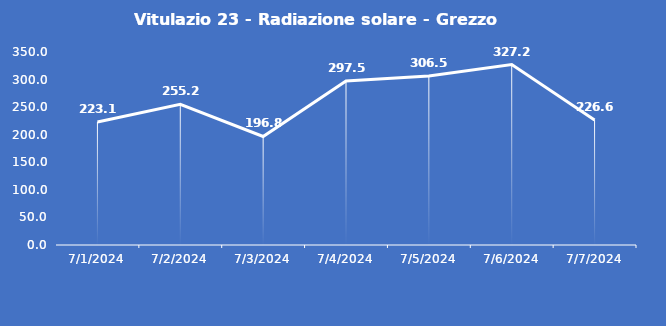
| Category | Vitulazio 23 - Radiazione solare - Grezzo (W/m2) |
|---|---|
| 7/1/24 | 223.1 |
| 7/2/24 | 255.2 |
| 7/3/24 | 196.8 |
| 7/4/24 | 297.5 |
| 7/5/24 | 306.5 |
| 7/6/24 | 327.2 |
| 7/7/24 | 226.6 |